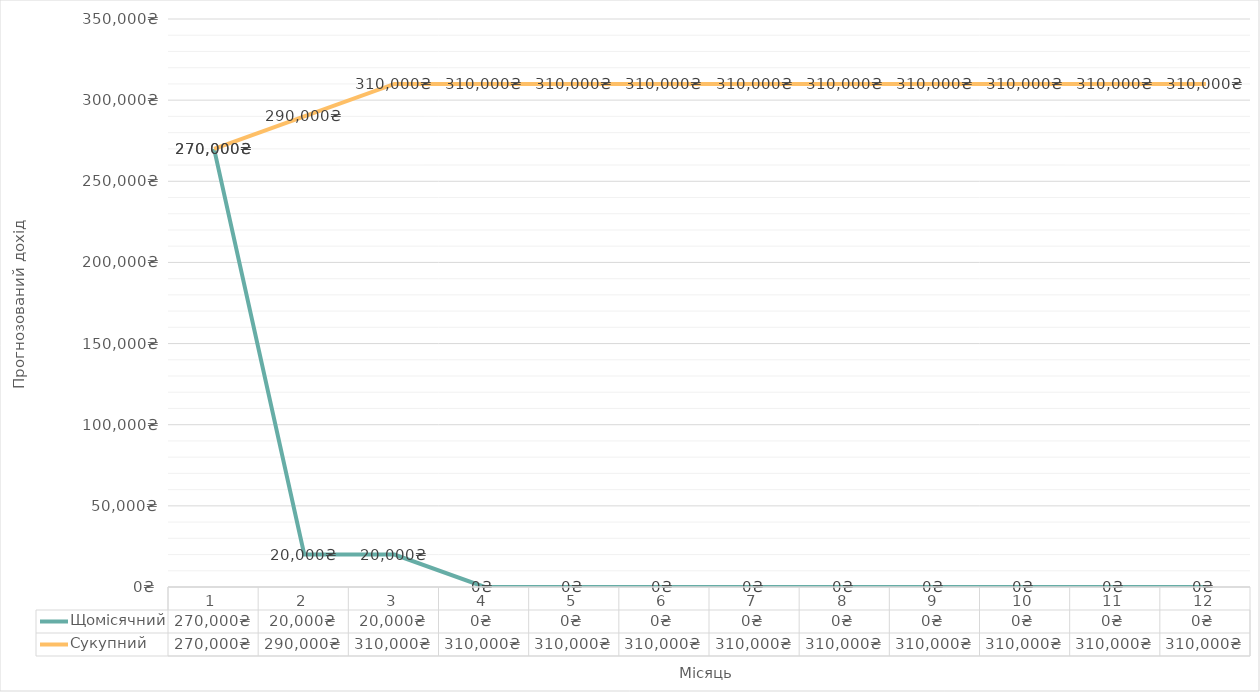
| Category | Щомісячний | Сукупний |
|---|---|---|
| 0 | 270000 | 270000 |
| 1 | 20000 | 290000 |
| 2 | 20000 | 310000 |
| 3 | 0 | 310000 |
| 4 | 0 | 310000 |
| 5 | 0 | 310000 |
| 6 | 0 | 310000 |
| 7 | 0 | 310000 |
| 8 | 0 | 310000 |
| 9 | 0 | 310000 |
| 10 | 0 | 310000 |
| 11 | 0 | 310000 |